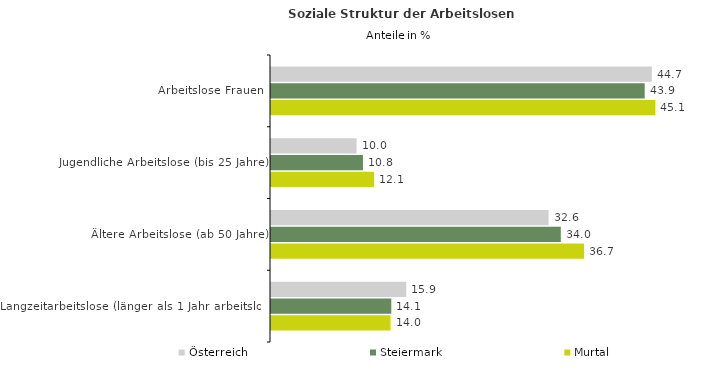
| Category | Österreich | Steiermark | Murtal |
|---|---|---|---|
| Arbeitslose Frauen | 44.699 | 43.86 | 45.117 |
| Jugendliche Arbeitslose (bis 25 Jahre) | 10.046 | 10.794 | 12.097 |
| Ältere Arbeitslose (ab 50 Jahre) | 32.578 | 34.015 | 36.738 |
| Langzeitarbeitslose (länger als 1 Jahr arbeitslos) | 15.879 | 14.12 | 14.031 |